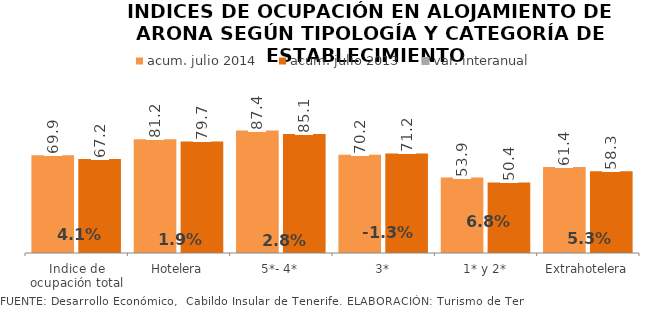
| Category | acum. julio 2014 | acum. julio 2013 |
|---|---|---|
| Indice de ocupación total | 69.909 | 67.182 |
| Hotelera | 81.202 | 79.678 |
| 5*- 4* | 87.439 | 85.068 |
| 3* | 70.206 | 71.154 |
| 1* y 2* | 53.871 | 50.439 |
| Extrahotelera | 61.421 | 58.307 |